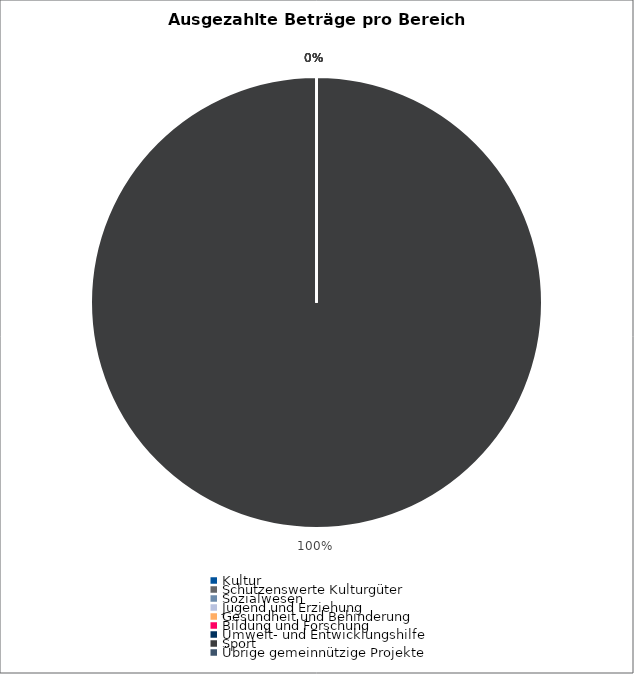
| Category | Series 0 |
|---|---|
| Kultur | 0 |
| Schützenswerte Kulturgüter | 0 |
| Sozialwesen | 0 |
| Jugend und Erziehung | 0 |
| Gesundheit und Behinderung | 0 |
| Bildung und Forschung | 0 |
| Umwelt- und Entwicklungshilfe | 0 |
| Sport | 3786883.23 |
| Übrige gemeinnützige Projekte | 0 |